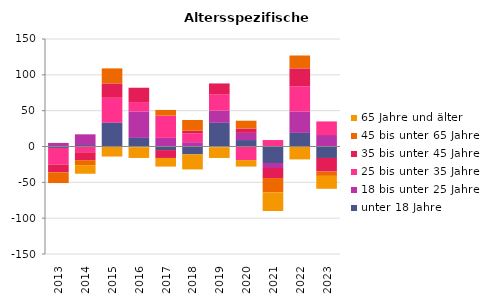
| Category | unter 18 Jahre | 18 bis unter 25 Jahre | 25 bis unter 35 Jahre | 35 bis unter 45 Jahre | 45 bis unter 65 Jahre | 65 Jahre und älter |
|---|---|---|---|---|---|---|
| 2013.0 | -2 | 5 | -23 | -11 | -15 | 0 |
| 2014.0 | 2 | 15 | -8 | -11 | -7 | -12 |
| 2015.0 | 33 | 1 | 34 | 20 | 21 | -14 |
| 2016.0 | 12 | 37 | 13 | 20 | -1 | -15 |
| 2017.0 | -5 | 12 | 31 | -11 | 8 | -12 |
| 2018.0 | -11 | 6 | 12 | 4 | 15 | -21 |
| 2019.0 | 33 | 17 | 23 | 15 | -1 | -15 |
| 2020.0 | 9 | 10 | -19 | 6 | 11 | -9 |
| 2021.0 | -23 | -7 | 9 | -14 | -20 | -26 |
| 2022.0 | 19 | 30 | 35 | 25 | 18 | -18 |
| 2023.0 | -16 | 16 | 19 | -19 | -6 | -18 |